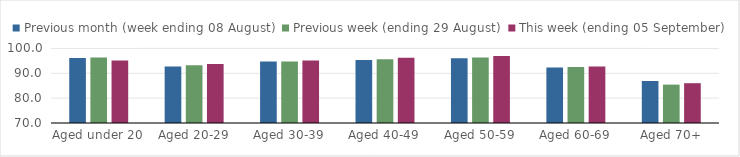
| Category | Previous month (week ending 08 August) | Previous week (ending 29 August) | This week (ending 05 September) |
|---|---|---|---|
| Aged under 20 | 96.11 | 96.31 | 95.18 |
| Aged 20-29 | 92.76 | 93.28 | 93.71 |
| Aged 30-39 | 94.7 | 94.78 | 95.16 |
| Aged 40-49 | 95.37 | 95.65 | 96.22 |
| Aged 50-59 | 96.02 | 96.4 | 97 |
| Aged 60-69 | 92.36 | 92.5 | 92.78 |
| Aged 70+ | 86.9 | 85.44 | 86.01 |